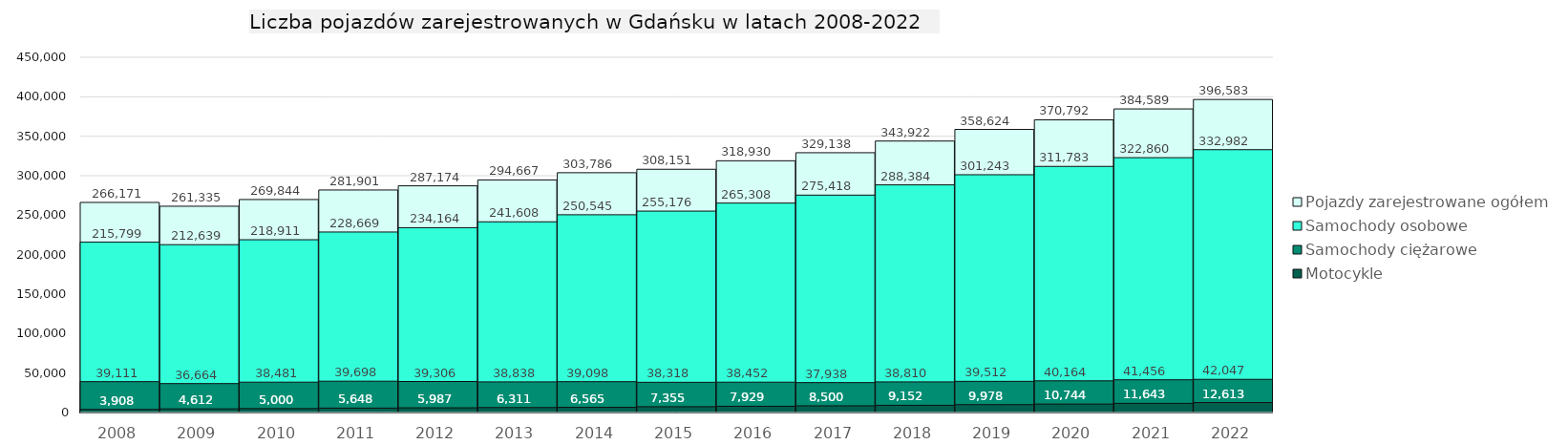
| Category | Pojazdy zarejestrowane ogółem | Samochody osobowe | Samochody ciężarowe | Motocykle |
|---|---|---|---|---|
| 2008.0 | 266171 | 215799 | 39111 | 3908 |
| 2009.0 | 261335 | 212639 | 36664 | 4612 |
| 2010.0 | 269844 | 218911 | 38481 | 5000 |
| 2011.0 | 281901 | 228669 | 39698 | 5648 |
| 2012.0 | 287174 | 234164 | 39306 | 5987 |
| 2013.0 | 294667 | 241608 | 38838 | 6311 |
| 2014.0 | 303786 | 250545 | 39098 | 6565 |
| 2015.0 | 308151 | 255176 | 38318 | 7355 |
| 2016.0 | 318930 | 265308 | 38452 | 7929 |
| 2017.0 | 329138 | 275418 | 37938 | 8500 |
| 2018.0 | 343922 | 288384 | 38810 | 9152 |
| 2019.0 | 358624 | 301243 | 39512 | 9978 |
| 2020.0 | 370792 | 311783 | 40164 | 10744 |
| 2021.0 | 384589 | 322860 | 41456 | 11643 |
| 2022.0 | 396583 | 332982 | 42047 | 12613 |